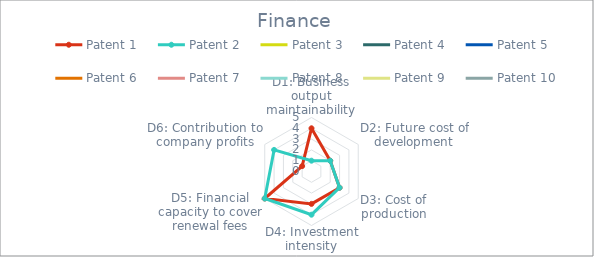
| Category | Patent 1 | Patent 2 | Patent 3 | Patent 4 | Patent 5 | Patent 6 | Patent 7 | Patent 8 | Patent 9 | Patent 10 |
|---|---|---|---|---|---|---|---|---|---|---|
| D1: Business output maintainability | 4 | 1 | 0 | 0 | 0 | 0 | 0 | 0 | 0 | 0 |
| D2: Future cost of development | 2 | 2 | 0 | 0 | 0 | 0 | 0 | 0 | 0 | 0 |
| D3: Cost of production | 3 | 3 | 0 | 0 | 0 | 0 | 0 | 0 | 0 | 0 |
| D4: Investment intensity | 3 | 4 | 0 | 0 | 0 | 0 | 0 | 0 | 0 | 0 |
| D5: Financial capacity to cover renewal fees | 5 | 5 | 0 | 0 | 0 | 0 | 0 | 0 | 0 | 0 |
| D6: Contribution to company profits | 1 | 4 | 0 | 0 | 0 | 0 | 0 | 0 | 0 | 0 |